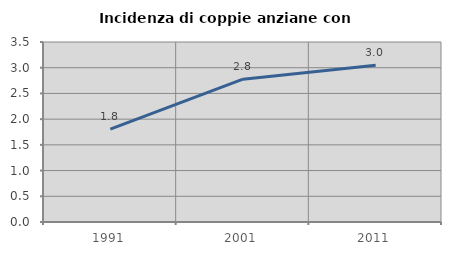
| Category | Incidenza di coppie anziane con figli |
|---|---|
| 1991.0 | 1.807 |
| 2001.0 | 2.776 |
| 2011.0 | 3.049 |